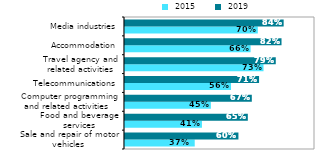
| Category |  2015 |  2019 |
|---|---|---|
| Sale and repair of motor vehicles | 0.367 | 0.597 |
| Food and beverage services | 0.405 | 0.646 |
|  Computer programming and related activities  | 0.452 | 0.667 |
| Telecommunications | 0.558 | 0.706 |
| Travel agency and related activities | 0.729 | 0.794 |
|  Accommodation | 0.661 | 0.824 |
| Media industries | 0.699 | 0.835 |